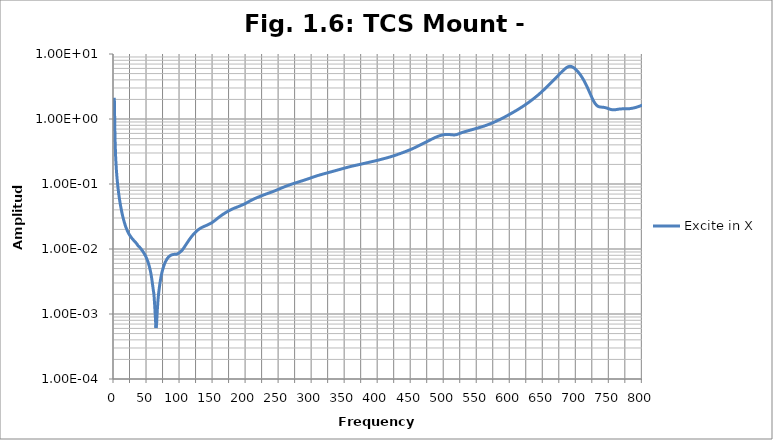
| Category | Excite in X |
|---|---|
| 0.0 | 2.126 |
| 1.0 | 0.513 |
| 2.0 | 0.259 |
| 3.0 | 0.171 |
| 4.0 | 0.125 |
| 5.0 | 0.098 |
| 6.0 | 0.08 |
| 7.0 | 0.067 |
| 8.0 | 0.057 |
| 9.0 | 0.049 |
| 10.0 | 0.043 |
| 11.0 | 0.038 |
| 12.0 | 0.034 |
| 13.0 | 0.031 |
| 14.0 | 0.028 |
| 15.0 | 0.026 |
| 16.0 | 0.024 |
| 17.0 | 0.022 |
| 18.0 | 0.021 |
| 19.0 | 0.02 |
| 20.0 | 0.019 |
| 21.0 | 0.018 |
| 22.0 | 0.017 |
| 23.0 | 0.016 |
| 24.0 | 0.016 |
| 25.0 | 0.015 |
| 26.0 | 0.015 |
| 27.0 | 0.014 |
| 28.0 | 0.014 |
| 29.0 | 0.014 |
| 30.0 | 0.013 |
| 31.0 | 0.013 |
| 32.0 | 0.013 |
| 33.0 | 0.012 |
| 34.0 | 0.012 |
| 35.0 | 0.012 |
| 36.0 | 0.011 |
| 37.0 | 0.011 |
| 38.0 | 0.011 |
| 39.0 | 0.01 |
| 40.0 | 0.01 |
| 41.0 | 0.01 |
| 42.0 | 0.01 |
| 43.0 | 0.009 |
| 44.0 | 0.009 |
| 45.0 | 0.009 |
| 46.0 | 0.008 |
| 47.0 | 0.008 |
| 48.0 | 0.008 |
| 49.0 | 0.007 |
| 50.0 | 0.007 |
| 51.0 | 0.006 |
| 52.0 | 0.006 |
| 53.0 | 0.005 |
| 54.0 | 0.005 |
| 55.0 | 0.004 |
| 56.0 | 0.004 |
| 57.0 | 0.003 |
| 58.0 | 0.003 |
| 59.0 | 0.002 |
| 60.0 | 0.002 |
| 61.0 | 0.001 |
| 62.0 | 0.001 |
| 63.0 | 0.001 |
| 64.0 | 0.001 |
| 65.0 | 0.001 |
| 66.0 | 0.002 |
| 67.0 | 0.002 |
| 68.0 | 0.002 |
| 69.0 | 0.003 |
| 70.0 | 0.003 |
| 71.0 | 0.004 |
| 72.0 | 0.004 |
| 73.0 | 0.005 |
| 74.0 | 0.005 |
| 75.0 | 0.006 |
| 76.0 | 0.006 |
| 77.0 | 0.006 |
| 78.0 | 0.007 |
| 79.0 | 0.007 |
| 80.0 | 0.007 |
| 81.0 | 0.007 |
| 82.0 | 0.008 |
| 83.0 | 0.008 |
| 84.0 | 0.008 |
| 85.0 | 0.008 |
| 86.0 | 0.008 |
| 87.0 | 0.008 |
| 88.0 | 0.008 |
| 89.0 | 0.008 |
| 90.0 | 0.008 |
| 91.0 | 0.008 |
| 92.0 | 0.008 |
| 93.0 | 0.008 |
| 94.0 | 0.008 |
| 95.0 | 0.008 |
| 96.0 | 0.008 |
| 97.0 | 0.009 |
| 98.0 | 0.009 |
| 99.0 | 0.009 |
| 100.0 | 0.009 |
| 101.0 | 0.009 |
| 102.0 | 0.009 |
| 103.0 | 0.01 |
| 104.0 | 0.01 |
| 105.0 | 0.01 |
| 106.0 | 0.011 |
| 107.0 | 0.011 |
| 108.0 | 0.011 |
| 109.0 | 0.012 |
| 110.0 | 0.012 |
| 111.0 | 0.013 |
| 112.0 | 0.013 |
| 113.0 | 0.014 |
| 114.0 | 0.014 |
| 115.0 | 0.015 |
| 116.0 | 0.015 |
| 117.0 | 0.016 |
| 118.0 | 0.016 |
| 119.0 | 0.016 |
| 120.0 | 0.017 |
| 121.0 | 0.017 |
| 122.0 | 0.018 |
| 123.0 | 0.018 |
| 124.0 | 0.019 |
| 125.0 | 0.019 |
| 126.0 | 0.019 |
| 127.0 | 0.02 |
| 128.0 | 0.02 |
| 129.0 | 0.02 |
| 130.0 | 0.021 |
| 131.0 | 0.021 |
| 132.0 | 0.021 |
| 133.0 | 0.022 |
| 134.0 | 0.022 |
| 135.0 | 0.022 |
| 136.0 | 0.022 |
| 137.0 | 0.022 |
| 138.0 | 0.023 |
| 139.0 | 0.023 |
| 140.0 | 0.023 |
| 141.0 | 0.023 |
| 142.0 | 0.024 |
| 143.0 | 0.024 |
| 144.0 | 0.024 |
| 145.0 | 0.025 |
| 146.0 | 0.025 |
| 147.0 | 0.025 |
| 148.0 | 0.025 |
| 149.0 | 0.026 |
| 150.0 | 0.026 |
| 151.0 | 0.027 |
| 152.0 | 0.027 |
| 153.0 | 0.028 |
| 154.0 | 0.028 |
| 155.0 | 0.029 |
| 156.0 | 0.029 |
| 157.0 | 0.03 |
| 158.0 | 0.031 |
| 159.0 | 0.031 |
| 160.0 | 0.032 |
| 161.0 | 0.032 |
| 162.0 | 0.033 |
| 163.0 | 0.033 |
| 164.0 | 0.034 |
| 165.0 | 0.034 |
| 166.0 | 0.035 |
| 167.0 | 0.035 |
| 168.0 | 0.036 |
| 169.0 | 0.037 |
| 170.0 | 0.037 |
| 171.0 | 0.038 |
| 172.0 | 0.038 |
| 173.0 | 0.039 |
| 174.0 | 0.039 |
| 175.0 | 0.04 |
| 176.0 | 0.04 |
| 177.0 | 0.04 |
| 178.0 | 0.041 |
| 179.0 | 0.041 |
| 180.0 | 0.042 |
| 181.0 | 0.042 |
| 182.0 | 0.043 |
| 183.0 | 0.043 |
| 184.0 | 0.043 |
| 185.0 | 0.044 |
| 186.0 | 0.044 |
| 187.0 | 0.045 |
| 188.0 | 0.045 |
| 189.0 | 0.045 |
| 190.0 | 0.046 |
| 191.0 | 0.046 |
| 192.0 | 0.047 |
| 193.0 | 0.047 |
| 194.0 | 0.048 |
| 195.0 | 0.048 |
| 196.0 | 0.049 |
| 197.0 | 0.049 |
| 198.0 | 0.05 |
| 199.0 | 0.05 |
| 200.0 | 0.051 |
| 201.0 | 0.052 |
| 202.0 | 0.052 |
| 203.0 | 0.053 |
| 204.0 | 0.054 |
| 205.0 | 0.055 |
| 206.0 | 0.055 |
| 207.0 | 0.056 |
| 208.0 | 0.057 |
| 209.0 | 0.057 |
| 210.0 | 0.058 |
| 211.0 | 0.059 |
| 212.0 | 0.059 |
| 213.0 | 0.06 |
| 214.0 | 0.06 |
| 215.0 | 0.061 |
| 216.0 | 0.062 |
| 217.0 | 0.062 |
| 218.0 | 0.063 |
| 219.0 | 0.064 |
| 220.0 | 0.064 |
| 221.0 | 0.065 |
| 222.0 | 0.065 |
| 223.0 | 0.066 |
| 224.0 | 0.067 |
| 225.0 | 0.067 |
| 226.0 | 0.068 |
| 227.0 | 0.068 |
| 228.0 | 0.069 |
| 229.0 | 0.07 |
| 230.0 | 0.07 |
| 231.0 | 0.071 |
| 232.0 | 0.071 |
| 233.0 | 0.072 |
| 234.0 | 0.073 |
| 235.0 | 0.073 |
| 236.0 | 0.074 |
| 237.0 | 0.074 |
| 238.0 | 0.075 |
| 239.0 | 0.076 |
| 240.0 | 0.076 |
| 241.0 | 0.077 |
| 242.0 | 0.078 |
| 243.0 | 0.079 |
| 244.0 | 0.079 |
| 245.0 | 0.08 |
| 246.0 | 0.081 |
| 247.0 | 0.082 |
| 248.0 | 0.082 |
| 249.0 | 0.083 |
| 250.0 | 0.084 |
| 251.0 | 0.085 |
| 252.0 | 0.086 |
| 253.0 | 0.087 |
| 254.0 | 0.087 |
| 255.0 | 0.088 |
| 256.0 | 0.089 |
| 257.0 | 0.09 |
| 258.0 | 0.091 |
| 259.0 | 0.092 |
| 260.0 | 0.093 |
| 261.0 | 0.093 |
| 262.0 | 0.094 |
| 263.0 | 0.095 |
| 264.0 | 0.096 |
| 265.0 | 0.097 |
| 266.0 | 0.097 |
| 267.0 | 0.098 |
| 268.0 | 0.099 |
| 269.0 | 0.1 |
| 270.0 | 0.101 |
| 271.0 | 0.101 |
| 272.0 | 0.102 |
| 273.0 | 0.103 |
| 274.0 | 0.104 |
| 275.0 | 0.104 |
| 276.0 | 0.105 |
| 277.0 | 0.106 |
| 278.0 | 0.107 |
| 279.0 | 0.108 |
| 280.0 | 0.108 |
| 281.0 | 0.109 |
| 282.0 | 0.11 |
| 283.0 | 0.111 |
| 284.0 | 0.112 |
| 285.0 | 0.112 |
| 286.0 | 0.113 |
| 287.0 | 0.114 |
| 288.0 | 0.115 |
| 289.0 | 0.116 |
| 290.0 | 0.117 |
| 291.0 | 0.118 |
| 292.0 | 0.119 |
| 293.0 | 0.12 |
| 294.0 | 0.121 |
| 295.0 | 0.122 |
| 296.0 | 0.123 |
| 297.0 | 0.124 |
| 298.0 | 0.125 |
| 299.0 | 0.126 |
| 300.0 | 0.127 |
| 301.0 | 0.128 |
| 302.0 | 0.129 |
| 303.0 | 0.13 |
| 304.0 | 0.131 |
| 305.0 | 0.132 |
| 306.0 | 0.133 |
| 307.0 | 0.134 |
| 308.0 | 0.135 |
| 309.0 | 0.136 |
| 310.0 | 0.137 |
| 311.0 | 0.138 |
| 312.0 | 0.139 |
| 313.0 | 0.14 |
| 314.0 | 0.14 |
| 315.0 | 0.141 |
| 316.0 | 0.142 |
| 317.0 | 0.143 |
| 318.0 | 0.144 |
| 319.0 | 0.145 |
| 320.0 | 0.146 |
| 321.0 | 0.147 |
| 322.0 | 0.148 |
| 323.0 | 0.149 |
| 324.0 | 0.15 |
| 325.0 | 0.151 |
| 326.0 | 0.152 |
| 327.0 | 0.153 |
| 328.0 | 0.154 |
| 329.0 | 0.155 |
| 330.0 | 0.156 |
| 331.0 | 0.157 |
| 332.0 | 0.158 |
| 333.0 | 0.159 |
| 334.0 | 0.16 |
| 335.0 | 0.161 |
| 336.0 | 0.162 |
| 337.0 | 0.163 |
| 338.0 | 0.164 |
| 339.0 | 0.165 |
| 340.0 | 0.166 |
| 341.0 | 0.167 |
| 342.0 | 0.168 |
| 343.0 | 0.169 |
| 344.0 | 0.17 |
| 345.0 | 0.172 |
| 346.0 | 0.173 |
| 347.0 | 0.174 |
| 348.0 | 0.175 |
| 349.0 | 0.176 |
| 350.0 | 0.177 |
| 351.0 | 0.178 |
| 352.0 | 0.18 |
| 353.0 | 0.181 |
| 354.0 | 0.182 |
| 355.0 | 0.183 |
| 356.0 | 0.184 |
| 357.0 | 0.185 |
| 358.0 | 0.186 |
| 359.0 | 0.187 |
| 360.0 | 0.188 |
| 361.0 | 0.189 |
| 362.0 | 0.19 |
| 363.0 | 0.191 |
| 364.0 | 0.192 |
| 365.0 | 0.193 |
| 366.0 | 0.194 |
| 367.0 | 0.195 |
| 368.0 | 0.196 |
| 369.0 | 0.197 |
| 370.0 | 0.198 |
| 371.0 | 0.199 |
| 372.0 | 0.2 |
| 373.0 | 0.201 |
| 374.0 | 0.203 |
| 375.0 | 0.204 |
| 376.0 | 0.205 |
| 377.0 | 0.206 |
| 378.0 | 0.207 |
| 379.0 | 0.208 |
| 380.0 | 0.209 |
| 381.0 | 0.21 |
| 382.0 | 0.212 |
| 383.0 | 0.213 |
| 384.0 | 0.214 |
| 385.0 | 0.215 |
| 386.0 | 0.216 |
| 387.0 | 0.217 |
| 388.0 | 0.218 |
| 389.0 | 0.22 |
| 390.0 | 0.221 |
| 391.0 | 0.222 |
| 392.0 | 0.223 |
| 393.0 | 0.224 |
| 394.0 | 0.226 |
| 395.0 | 0.227 |
| 396.0 | 0.228 |
| 397.0 | 0.23 |
| 398.0 | 0.231 |
| 399.0 | 0.232 |
| 400.0 | 0.234 |
| 401.0 | 0.235 |
| 402.0 | 0.236 |
| 403.0 | 0.238 |
| 404.0 | 0.239 |
| 405.0 | 0.241 |
| 406.0 | 0.242 |
| 407.0 | 0.244 |
| 408.0 | 0.245 |
| 409.0 | 0.247 |
| 410.0 | 0.248 |
| 411.0 | 0.25 |
| 412.0 | 0.251 |
| 413.0 | 0.253 |
| 414.0 | 0.255 |
| 415.0 | 0.256 |
| 416.0 | 0.258 |
| 417.0 | 0.26 |
| 418.0 | 0.262 |
| 419.0 | 0.264 |
| 420.0 | 0.266 |
| 421.0 | 0.268 |
| 422.0 | 0.27 |
| 423.0 | 0.272 |
| 424.0 | 0.274 |
| 425.0 | 0.276 |
| 426.0 | 0.278 |
| 427.0 | 0.28 |
| 428.0 | 0.283 |
| 429.0 | 0.285 |
| 430.0 | 0.287 |
| 431.0 | 0.29 |
| 432.0 | 0.292 |
| 433.0 | 0.295 |
| 434.0 | 0.297 |
| 435.0 | 0.3 |
| 436.0 | 0.302 |
| 437.0 | 0.305 |
| 438.0 | 0.308 |
| 439.0 | 0.31 |
| 440.0 | 0.313 |
| 441.0 | 0.316 |
| 442.0 | 0.319 |
| 443.0 | 0.322 |
| 444.0 | 0.325 |
| 445.0 | 0.328 |
| 446.0 | 0.331 |
| 447.0 | 0.334 |
| 448.0 | 0.337 |
| 449.0 | 0.34 |
| 450.0 | 0.344 |
| 451.0 | 0.347 |
| 452.0 | 0.351 |
| 453.0 | 0.355 |
| 454.0 | 0.359 |
| 455.0 | 0.363 |
| 456.0 | 0.367 |
| 457.0 | 0.371 |
| 458.0 | 0.375 |
| 459.0 | 0.38 |
| 460.0 | 0.384 |
| 461.0 | 0.389 |
| 462.0 | 0.393 |
| 463.0 | 0.398 |
| 464.0 | 0.402 |
| 465.0 | 0.407 |
| 466.0 | 0.412 |
| 467.0 | 0.416 |
| 468.0 | 0.421 |
| 469.0 | 0.426 |
| 470.0 | 0.431 |
| 471.0 | 0.436 |
| 472.0 | 0.442 |
| 473.0 | 0.447 |
| 474.0 | 0.453 |
| 475.0 | 0.458 |
| 476.0 | 0.464 |
| 477.0 | 0.469 |
| 478.0 | 0.475 |
| 479.0 | 0.481 |
| 480.0 | 0.486 |
| 481.0 | 0.492 |
| 482.0 | 0.498 |
| 483.0 | 0.503 |
| 484.0 | 0.509 |
| 485.0 | 0.515 |
| 486.0 | 0.52 |
| 487.0 | 0.525 |
| 488.0 | 0.531 |
| 489.0 | 0.536 |
| 490.0 | 0.541 |
| 491.0 | 0.546 |
| 492.0 | 0.55 |
| 493.0 | 0.554 |
| 494.0 | 0.558 |
| 495.0 | 0.562 |
| 496.0 | 0.566 |
| 497.0 | 0.569 |
| 498.0 | 0.571 |
| 499.0 | 0.574 |
| 500.0 | 0.576 |
| 501.0 | 0.577 |
| 502.0 | 0.578 |
| 503.0 | 0.579 |
| 504.0 | 0.579 |
| 505.0 | 0.579 |
| 506.0 | 0.578 |
| 507.0 | 0.578 |
| 508.0 | 0.576 |
| 509.0 | 0.575 |
| 510.0 | 0.573 |
| 511.0 | 0.572 |
| 512.0 | 0.57 |
| 513.0 | 0.569 |
| 514.0 | 0.569 |
| 515.0 | 0.569 |
| 516.0 | 0.57 |
| 517.0 | 0.572 |
| 518.0 | 0.575 |
| 519.0 | 0.579 |
| 520.0 | 0.584 |
| 521.0 | 0.589 |
| 522.0 | 0.595 |
| 523.0 | 0.6 |
| 524.0 | 0.606 |
| 525.0 | 0.611 |
| 526.0 | 0.616 |
| 527.0 | 0.621 |
| 528.0 | 0.626 |
| 529.0 | 0.631 |
| 530.0 | 0.635 |
| 531.0 | 0.639 |
| 532.0 | 0.643 |
| 533.0 | 0.648 |
| 534.0 | 0.652 |
| 535.0 | 0.656 |
| 536.0 | 0.661 |
| 537.0 | 0.665 |
| 538.0 | 0.67 |
| 539.0 | 0.674 |
| 540.0 | 0.678 |
| 541.0 | 0.683 |
| 542.0 | 0.687 |
| 543.0 | 0.692 |
| 544.0 | 0.697 |
| 545.0 | 0.701 |
| 546.0 | 0.706 |
| 547.0 | 0.711 |
| 548.0 | 0.715 |
| 549.0 | 0.72 |
| 550.0 | 0.725 |
| 551.0 | 0.73 |
| 552.0 | 0.735 |
| 553.0 | 0.74 |
| 554.0 | 0.745 |
| 555.0 | 0.751 |
| 556.0 | 0.756 |
| 557.0 | 0.762 |
| 558.0 | 0.767 |
| 559.0 | 0.773 |
| 560.0 | 0.779 |
| 561.0 | 0.785 |
| 562.0 | 0.792 |
| 563.0 | 0.799 |
| 564.0 | 0.805 |
| 565.0 | 0.812 |
| 566.0 | 0.82 |
| 567.0 | 0.827 |
| 568.0 | 0.834 |
| 569.0 | 0.842 |
| 570.0 | 0.85 |
| 571.0 | 0.859 |
| 572.0 | 0.867 |
| 573.0 | 0.876 |
| 574.0 | 0.885 |
| 575.0 | 0.894 |
| 576.0 | 0.903 |
| 577.0 | 0.913 |
| 578.0 | 0.923 |
| 579.0 | 0.933 |
| 580.0 | 0.943 |
| 581.0 | 0.953 |
| 582.0 | 0.964 |
| 583.0 | 0.975 |
| 584.0 | 0.986 |
| 585.0 | 0.997 |
| 586.0 | 1.009 |
| 587.0 | 1.021 |
| 588.0 | 1.033 |
| 589.0 | 1.045 |
| 590.0 | 1.058 |
| 591.0 | 1.071 |
| 592.0 | 1.084 |
| 593.0 | 1.098 |
| 594.0 | 1.112 |
| 595.0 | 1.126 |
| 596.0 | 1.141 |
| 597.0 | 1.156 |
| 598.0 | 1.171 |
| 599.0 | 1.187 |
| 600.0 | 1.202 |
| 601.0 | 1.218 |
| 602.0 | 1.235 |
| 603.0 | 1.252 |
| 604.0 | 1.269 |
| 605.0 | 1.287 |
| 606.0 | 1.304 |
| 607.0 | 1.322 |
| 608.0 | 1.34 |
| 609.0 | 1.358 |
| 610.0 | 1.377 |
| 611.0 | 1.397 |
| 612.0 | 1.417 |
| 613.0 | 1.438 |
| 614.0 | 1.459 |
| 615.0 | 1.481 |
| 616.0 | 1.504 |
| 617.0 | 1.527 |
| 618.0 | 1.55 |
| 619.0 | 1.574 |
| 620.0 | 1.599 |
| 621.0 | 1.624 |
| 622.0 | 1.65 |
| 623.0 | 1.677 |
| 624.0 | 1.704 |
| 625.0 | 1.732 |
| 626.0 | 1.761 |
| 627.0 | 1.791 |
| 628.0 | 1.821 |
| 629.0 | 1.853 |
| 630.0 | 1.885 |
| 631.0 | 1.919 |
| 632.0 | 1.953 |
| 633.0 | 1.989 |
| 634.0 | 2.025 |
| 635.0 | 2.063 |
| 636.0 | 2.101 |
| 637.0 | 2.14 |
| 638.0 | 2.18 |
| 639.0 | 2.222 |
| 640.0 | 2.264 |
| 641.0 | 2.308 |
| 642.0 | 2.355 |
| 643.0 | 2.404 |
| 644.0 | 2.455 |
| 645.0 | 2.506 |
| 646.0 | 2.559 |
| 647.0 | 2.614 |
| 648.0 | 2.67 |
| 649.0 | 2.729 |
| 650.0 | 2.789 |
| 651.0 | 2.852 |
| 652.0 | 2.917 |
| 653.0 | 2.984 |
| 654.0 | 3.053 |
| 655.0 | 3.123 |
| 656.0 | 3.196 |
| 657.0 | 3.27 |
| 658.0 | 3.347 |
| 659.0 | 3.426 |
| 660.0 | 3.508 |
| 661.0 | 3.591 |
| 662.0 | 3.677 |
| 663.0 | 3.766 |
| 664.0 | 3.856 |
| 665.0 | 3.949 |
| 666.0 | 4.044 |
| 667.0 | 4.141 |
| 668.0 | 4.24 |
| 669.0 | 4.342 |
| 670.0 | 4.448 |
| 671.0 | 4.557 |
| 672.0 | 4.667 |
| 673.0 | 4.781 |
| 674.0 | 4.896 |
| 675.0 | 5.012 |
| 676.0 | 5.129 |
| 677.0 | 5.251 |
| 678.0 | 5.375 |
| 679.0 | 5.5 |
| 680.0 | 5.626 |
| 681.0 | 5.751 |
| 682.0 | 5.873 |
| 683.0 | 5.99 |
| 684.0 | 6.101 |
| 685.0 | 6.202 |
| 686.0 | 6.291 |
| 687.0 | 6.365 |
| 688.0 | 6.419 |
| 689.0 | 6.453 |
| 690.0 | 6.465 |
| 691.0 | 6.454 |
| 692.0 | 6.421 |
| 693.0 | 6.368 |
| 694.0 | 6.297 |
| 695.0 | 6.21 |
| 696.0 | 6.111 |
| 697.0 | 6.001 |
| 698.0 | 5.882 |
| 699.0 | 5.756 |
| 700.0 | 5.623 |
| 701.0 | 5.485 |
| 702.0 | 5.342 |
| 703.0 | 5.195 |
| 704.0 | 5.043 |
| 705.0 | 4.888 |
| 706.0 | 4.73 |
| 707.0 | 4.569 |
| 708.0 | 4.407 |
| 709.0 | 4.243 |
| 710.0 | 4.078 |
| 711.0 | 3.912 |
| 712.0 | 3.747 |
| 713.0 | 3.583 |
| 714.0 | 3.42 |
| 715.0 | 3.26 |
| 716.0 | 3.103 |
| 717.0 | 2.949 |
| 718.0 | 2.8 |
| 719.0 | 2.656 |
| 720.0 | 2.518 |
| 721.0 | 2.388 |
| 722.0 | 2.265 |
| 723.0 | 2.151 |
| 724.0 | 2.046 |
| 725.0 | 1.951 |
| 726.0 | 1.867 |
| 727.0 | 1.793 |
| 728.0 | 1.729 |
| 729.0 | 1.677 |
| 730.0 | 1.634 |
| 731.0 | 1.6 |
| 732.0 | 1.574 |
| 733.0 | 1.555 |
| 734.0 | 1.542 |
| 735.0 | 1.533 |
| 736.0 | 1.528 |
| 737.0 | 1.524 |
| 738.0 | 1.522 |
| 739.0 | 1.519 |
| 740.0 | 1.516 |
| 741.0 | 1.512 |
| 742.0 | 1.506 |
| 743.0 | 1.499 |
| 744.0 | 1.49 |
| 745.0 | 1.48 |
| 746.0 | 1.469 |
| 747.0 | 1.457 |
| 748.0 | 1.444 |
| 749.0 | 1.432 |
| 750.0 | 1.42 |
| 751.0 | 1.41 |
| 752.0 | 1.4 |
| 753.0 | 1.393 |
| 754.0 | 1.388 |
| 755.0 | 1.385 |
| 756.0 | 1.384 |
| 757.0 | 1.385 |
| 758.0 | 1.388 |
| 759.0 | 1.392 |
| 760.0 | 1.397 |
| 761.0 | 1.403 |
| 762.0 | 1.409 |
| 763.0 | 1.414 |
| 764.0 | 1.419 |
| 765.0 | 1.423 |
| 766.0 | 1.426 |
| 767.0 | 1.429 |
| 768.0 | 1.431 |
| 769.0 | 1.432 |
| 770.0 | 1.432 |
| 771.0 | 1.432 |
| 772.0 | 1.432 |
| 773.0 | 1.431 |
| 774.0 | 1.431 |
| 775.0 | 1.431 |
| 776.0 | 1.432 |
| 777.0 | 1.434 |
| 778.0 | 1.436 |
| 779.0 | 1.439 |
| 780.0 | 1.442 |
| 781.0 | 1.446 |
| 782.0 | 1.451 |
| 783.0 | 1.456 |
| 784.0 | 1.462 |
| 785.0 | 1.469 |
| 786.0 | 1.476 |
| 787.0 | 1.483 |
| 788.0 | 1.492 |
| 789.0 | 1.501 |
| 790.0 | 1.511 |
| 791.0 | 1.521 |
| 792.0 | 1.532 |
| 793.0 | 1.544 |
| 794.0 | 1.557 |
| 795.0 | 1.57 |
| 796.0 | 1.584 |
| 797.0 | 1.598 |
| 798.0 | 1.613 |
| 799.0 | 1.629 |
| 800.0 | 1.644 |